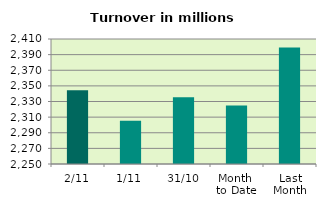
| Category | Series 0 |
|---|---|
| 2/11 | 2344.522 |
| 1/11 | 2305.307 |
| 31/10 | 2335.507 |
| Month 
to Date | 2324.914 |
| Last
Month | 2399.244 |